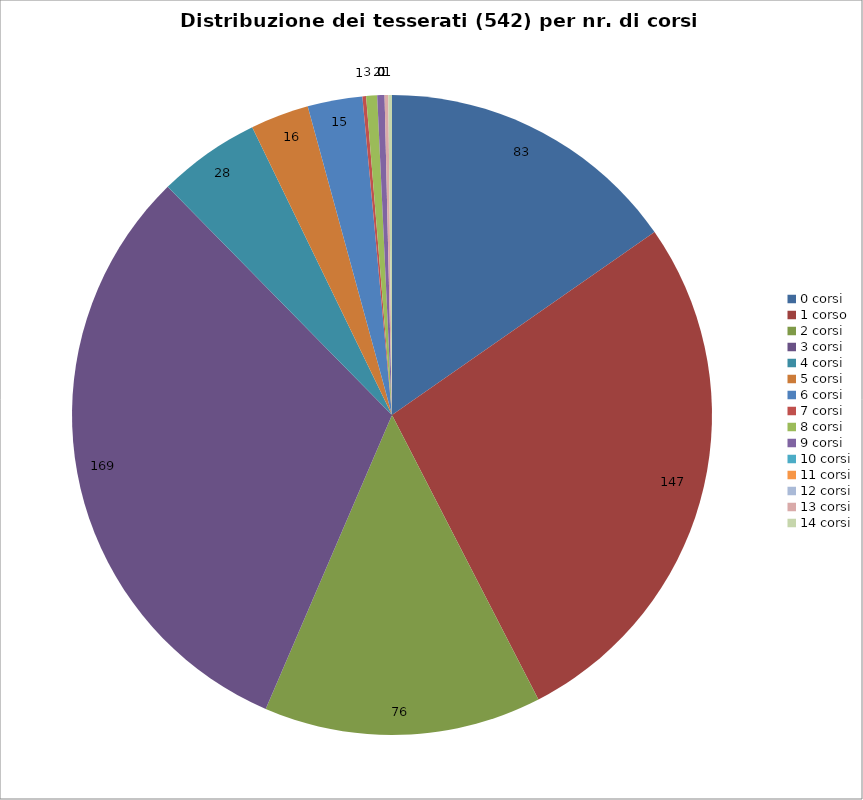
| Category | Nr. Tesserati |
|---|---|
| 0 corsi | 83 |
| 1 corso | 147 |
| 2 corsi | 76 |
| 3 corsi | 169 |
| 4 corsi | 28 |
| 5 corsi | 16 |
| 6 corsi | 15 |
| 7 corsi | 1 |
| 8 corsi | 3 |
| 9 corsi | 2 |
| 10 corsi | 0 |
| 11 corsi | 0 |
| 12 corsi | 0 |
| 13 corsi | 1 |
| 14 corsi | 1 |